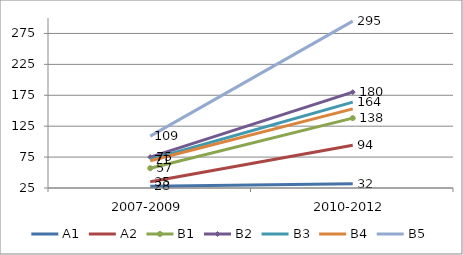
| Category | A1 | A2 | B1 | B2 | B3 | B4 | B5 |
|---|---|---|---|---|---|---|---|
| 2007-2009 | 28 | 35 | 57 | 75 | 71 | 69 | 109 |
| 2010-2012 | 32 | 94 | 138 | 180 | 164 | 153 | 295 |